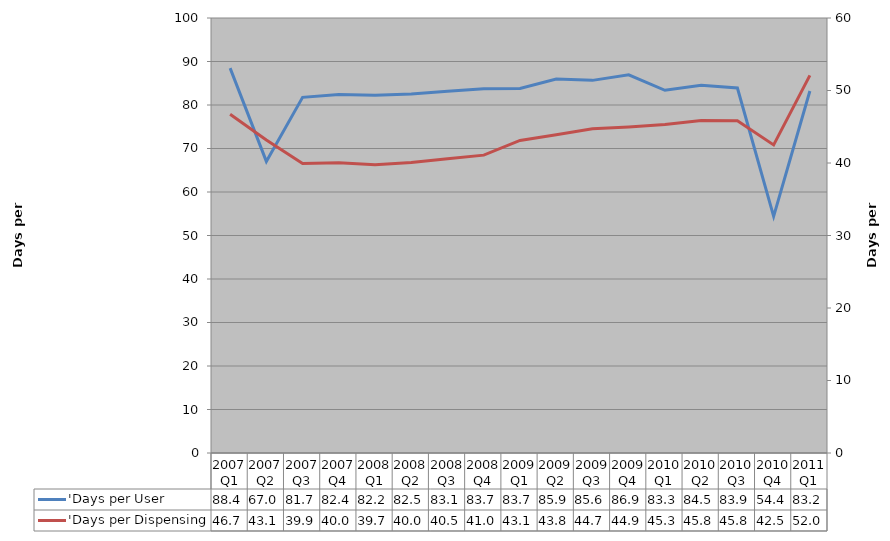
| Category | 'Days per User |
|---|---|
| 2007Q1 | 88.486 |
| 2007Q2 | 67.037 |
| 2007Q3 | 81.758 |
| 2007Q4 | 82.426 |
| 2008Q1 | 82.223 |
| 2008Q2 | 82.532 |
| 2008Q3 | 83.139 |
| 2008Q4 | 83.761 |
| 2009Q1 | 83.788 |
| 2009Q2 | 85.958 |
| 2009Q3 | 85.662 |
| 2009Q4 | 86.945 |
| 2010Q1 | 83.384 |
| 2010Q2 | 84.559 |
| 2010Q3 | 83.91 |
| 2010Q4 | 54.407 |
| 2011Q1 | 83.224 |